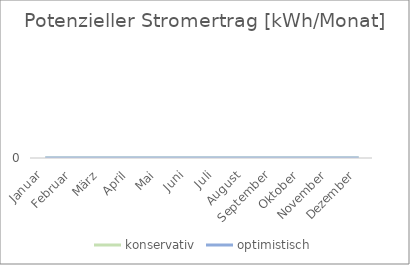
| Category | konservativ | optimistisch |
|---|---|---|
| Januar | 0 | 0 |
| Februar | 0 | 0 |
| März | 0 | 0 |
| April | 0 | 0 |
| Mai | 0 | 0 |
| Juni | 0 | 0 |
| Juli | 0 | 0 |
| August | 0 | 0 |
| September | 0 | 0 |
| Oktober | 0 | 0 |
| November | 0 | 0 |
| Dezember | 0 | 0 |